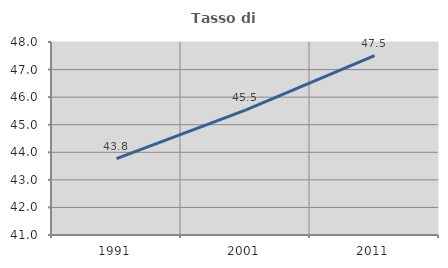
| Category | Tasso di occupazione   |
|---|---|
| 1991.0 | 43.77 |
| 2001.0 | 45.527 |
| 2011.0 | 47.505 |